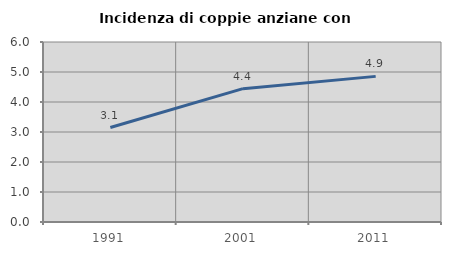
| Category | Incidenza di coppie anziane con figli |
|---|---|
| 1991.0 | 3.15 |
| 2001.0 | 4.444 |
| 2011.0 | 4.854 |